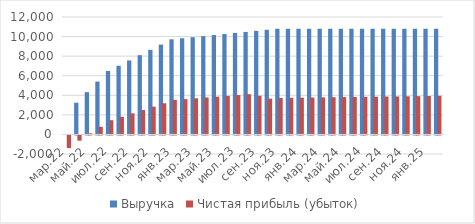
| Category | Выручка | Чистая прибыль (убыток) |
|---|---|---|
| мар.22 | 0 | -1294.75 |
| апр.22 | 3240 | -537.564 |
| май.22 | 4320 | 112.787 |
| июн.22 | 5400 | 781.687 |
| июл.22 | 6480 | 1456.537 |
| авг.22 | 7020 | 1801.178 |
| сен.22 | 7560 | 2147.078 |
| окт.22 | 8100 | 2492.979 |
| ноя.22 | 8640 | 2838.879 |
| дек.22 | 9180 | 3184.78 |
| янв.23 | 9720 | 3530.68 |
| фев.23 | 9828 | 3612.413 |
| мар.23 | 9936 | 3695.153 |
| апр.23 | 10044 | 3777.894 |
| май.23 | 10152 | 3860.634 |
| июн.23 | 10260 | 3943.375 |
| июл.23 | 10368 | 4026.115 |
| авг.23 | 10476 | 4108.856 |
| сен.23 | 10584 | 3950.967 |
| окт.23 | 10692 | 3660.294 |
| ноя.23 | 10800 | 3731.541 |
| дек.23 | 10800 | 3742.358 |
| янв.24 | 10800 | 3756.73 |
| фев.24 | 10800 | 3771.138 |
| мар.24 | 10800 | 3785.546 |
| апр.24 | 10800 | 3799.954 |
| май.24 | 10800 | 3814.362 |
| июн.24 | 10800 | 3828.77 |
| июл.24 | 10800 | 3843.178 |
| авг.24 | 10800 | 3857.586 |
| сен.24 | 10800 | 3871.994 |
| окт.24 | 10800 | 3886.402 |
| ноя.24 | 10800 | 3900.81 |
| дек.24 | 10800 | 3915.217 |
| янв.25 | 10800 | 3929.625 |
| фев.25 | 10800 | 3944.033 |